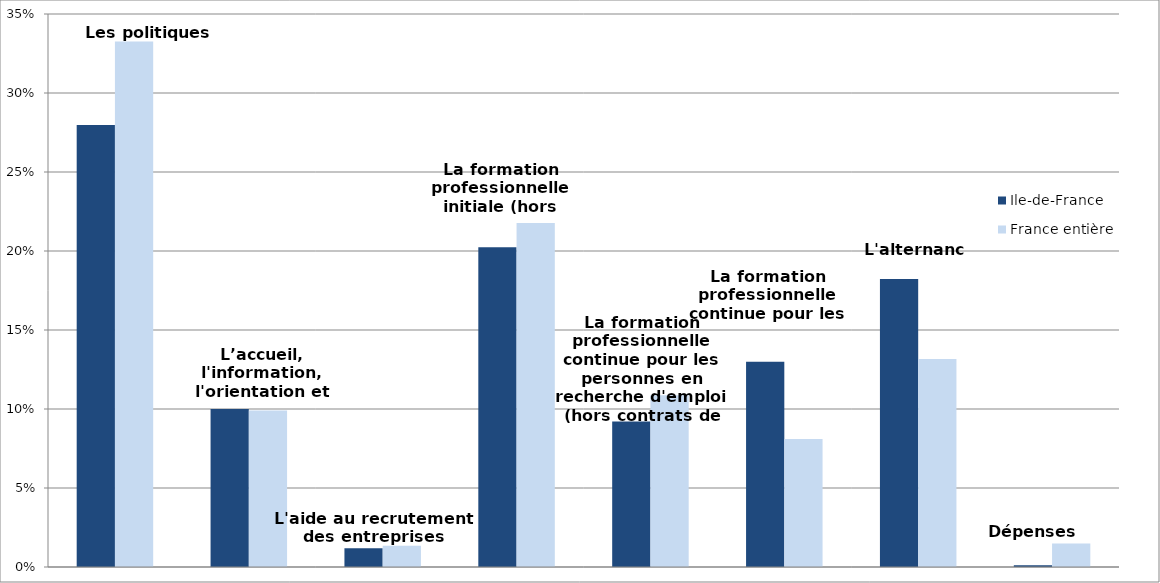
| Category | Ile-de-France | France entière |
|---|---|---|
| Les politiques d'emploi | 0.28 | 0.333 |
| L’accueil, l'information, l'orientation et l'accompagnement | 0.1 | 0.099 |
| L'aide au recrutement des entreprises | 0.012 | 0.013 |
| La formation professionnelle initiale (hors apprentissage) | 0.202 | 0.218 |
| La formation professionnelle continue pour les personnes en recherche d'emploi (hors contrats de professionnalisation) | 0.092 | 0.109 |
| La formation professionnelle continue pour les actifs occupés | 0.13 | 0.081 |
| L'alternance | 0.182 | 0.132 |
| Dépenses non-ventilables | 0.001 | 0.015 |